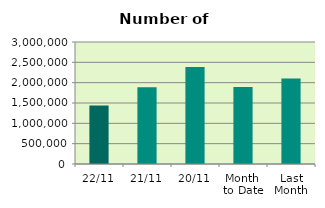
| Category | Series 0 |
|---|---|
| 22/11 | 1439378 |
| 21/11 | 1886922 |
| 20/11 | 2384378 |
| Month 
to Date | 1891494.875 |
| Last
Month | 2101052.87 |